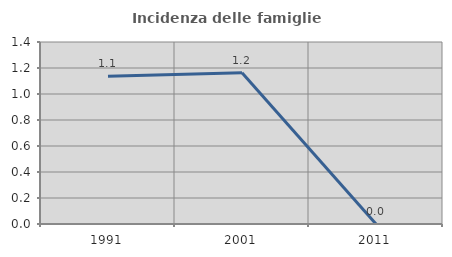
| Category | Incidenza delle famiglie numerose |
|---|---|
| 1991.0 | 1.136 |
| 2001.0 | 1.163 |
| 2011.0 | 0 |